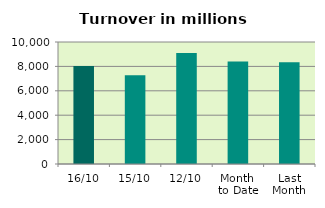
| Category | Series 0 |
|---|---|
| 16/10 | 8034.802 |
| 15/10 | 7266.839 |
| 12/10 | 9095.915 |
| Month 
to Date | 8393.448 |
| Last
Month | 8346.546 |